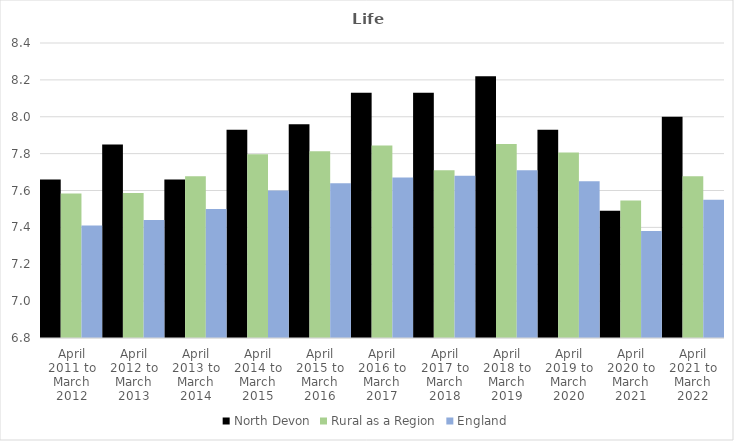
| Category | North Devon | Rural as a Region | England |
|---|---|---|---|
| April 2011 to March 2012 | 7.66 | 7.584 | 7.41 |
| April 2012 to March 2013 | 7.85 | 7.586 | 7.44 |
| April 2013 to March 2014 | 7.66 | 7.677 | 7.5 |
| April 2014 to March 2015 | 7.93 | 7.797 | 7.6 |
| April 2015 to March 2016 | 7.96 | 7.813 | 7.64 |
| April 2016 to March 2017 | 8.13 | 7.845 | 7.67 |
| April 2017 to March 2018 | 8.13 | 7.71 | 7.68 |
| April 2018 to March 2019 | 8.22 | 7.852 | 7.71 |
| April 2019 to March 2020 | 7.93 | 7.806 | 7.65 |
| April 2020 to March 2021 | 7.49 | 7.546 | 7.38 |
| April 2021 to March 2022 | 8 | 7.677 | 7.55 |